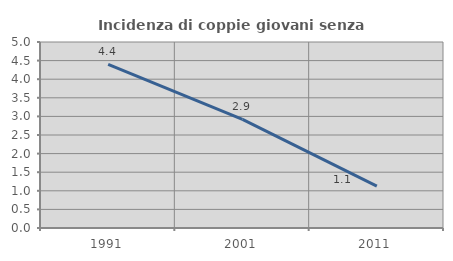
| Category | Incidenza di coppie giovani senza figli |
|---|---|
| 1991.0 | 4.401 |
| 2001.0 | 2.922 |
| 2011.0 | 1.126 |